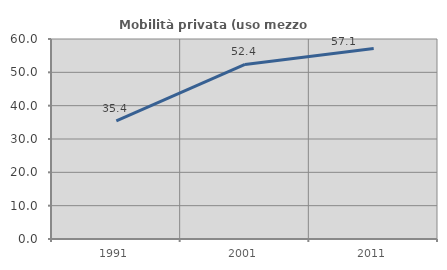
| Category | Mobilità privata (uso mezzo privato) |
|---|---|
| 1991.0 | 35.405 |
| 2001.0 | 52.381 |
| 2011.0 | 57.123 |